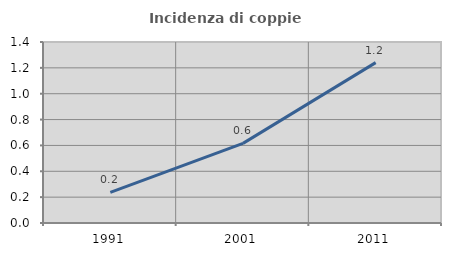
| Category | Incidenza di coppie miste |
|---|---|
| 1991.0 | 0.236 |
| 2001.0 | 0.616 |
| 2011.0 | 1.24 |